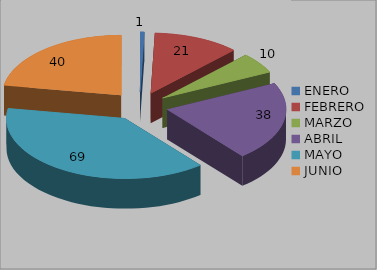
| Category | Series 0 |
|---|---|
| ENERO | 1 |
| FEBRERO | 21 |
| MARZO | 10 |
| ABRIL | 38 |
| MAYO | 69 |
| JUNIO | 40 |